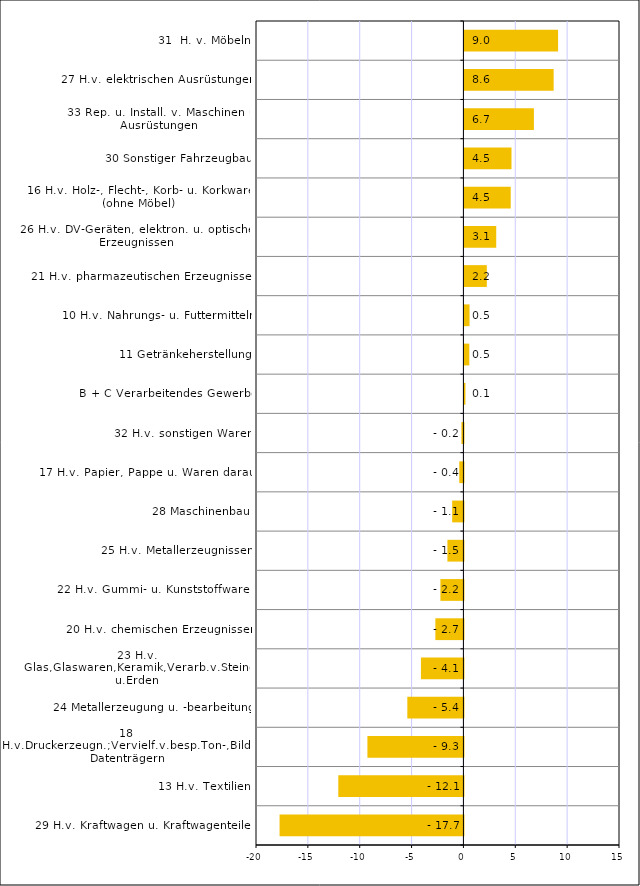
| Category | Series 0 |
|---|---|
| 29 H.v. Kraftwagen u. Kraftwagenteilen | -17.727 |
| 13 H.v. Textilien | -12.065 |
| 18 H.v.Druckerzeugn.;Vervielf.v.besp.Ton-,Bild-u.Datenträgern | -9.258 |
| 24 Metallerzeugung u. -bearbeitung | -5.409 |
| 23 H.v. Glas,Glaswaren,Keramik,Verarb.v.Steinen u.Erden | -4.097 |
| 20 H.v. chemischen Erzeugnissen | -2.707 |
| 22 H.v. Gummi- u. Kunststoffwaren | -2.22 |
| 25 H.v. Metallerzeugnissen | -1.543 |
| 28 Maschinenbau | -1.085 |
| 17 H.v. Papier, Pappe u. Waren daraus | -0.4 |
| 32 H.v. sonstigen Waren | -0.193 |
| B + C Verarbeitendes Gewerbe | 0.094 |
| 11 Getränkeherstellung | 0.469 |
| 10 H.v. Nahrungs- u. Futtermitteln | 0.494 |
| 21 H.v. pharmazeutischen Erzeugnissen | 2.157 |
| 26 H.v. DV-Geräten, elektron. u. optischen Erzeugnissen | 3.066 |
| 16 H.v. Holz-, Flecht-, Korb- u. Korkwaren (ohne Möbel) | 4.462 |
| 30 Sonstiger Fahrzeugbau | 4.538 |
| 33 Rep. u. Install. v. Maschinen u. Ausrüstungen | 6.699 |
| 27 H.v. elektrischen Ausrüstungen | 8.603 |
| 31  H. v. Möbeln | 9.029 |